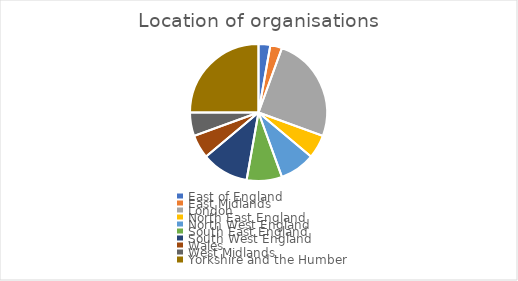
| Category | Number of respondents |
|---|---|
| East of England | 1 |
| East Midlands | 1 |
| London | 9 |
| North East England | 2 |
| North West England | 3 |
| South East England | 3 |
| South West England | 4 |
| Wales | 2 |
| West Midlands | 2 |
| Yorkshire and the Humber | 9 |